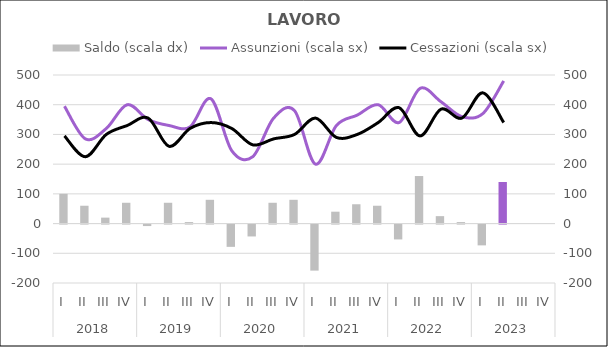
| Category | Saldo (scala dx) |
|---|---|
| 0 | 100 |
| 1 | 60 |
| 2 | 20 |
| 3 | 70 |
| 4 | -5 |
| 5 | 70 |
| 6 | 5 |
| 7 | 80 |
| 8 | -75 |
| 9 | -40 |
| 10 | 70 |
| 11 | 80 |
| 12 | -155 |
| 13 | 40 |
| 14 | 65 |
| 15 | 60 |
| 16 | -50 |
| 17 | 160 |
| 18 | 25 |
| 19 | 5 |
| 20 | -70 |
| 21 | 140 |
| 22 | 0 |
| 23 | 0 |